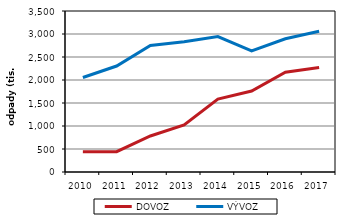
| Category | DOVOZ | VÝVOZ |
|---|---|---|
| 2010.0 | 441726.079 | 2053594.675 |
| 2011.0 | 441699.92 | 2303711.556 |
| 2012.0 | 782886.551 | 2752429.139 |
| 2013.0 | 1021485.055 | 2829427.661 |
| 2014.0 | 1584294.884 | 2945018.485 |
| 2015.0 | 1759403.678 | 2631438.585 |
| 2016.0 | 2167100.012 | 2895834.811 |
| 2017.0 | 2273666.155 | 3060244.075 |